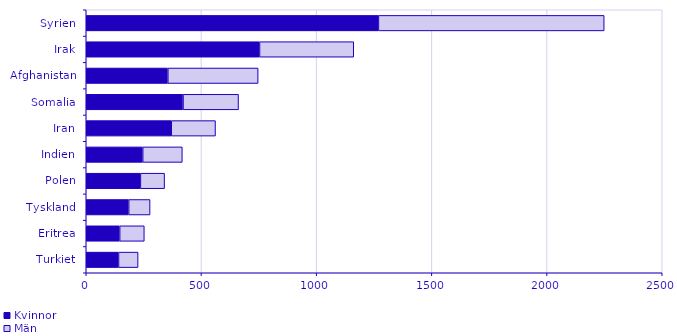
| Category | Kvinnor | Män |
|---|---|---|
| Syrien | 1268 | 980 |
| Irak | 752 | 409 |
| Afghanistan | 354 | 392 |
| Somalia | 420 | 241 |
| Iran | 369 | 192 |
| Indien | 245 | 172 |
| Polen | 235 | 105 |
| Tyskland | 184 | 93 |
| Eritrea | 145 | 107 |
| Turkiet | 140 | 85 |